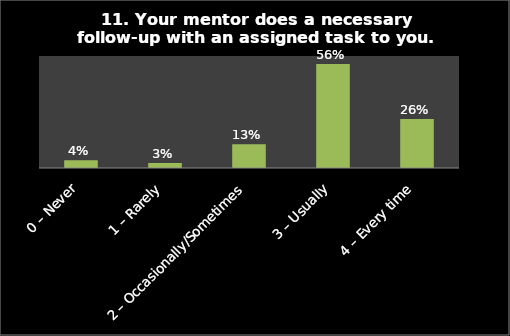
| Category | Series 0 |
|---|---|
| 0 – Never | 0.041 |
| 1 – Rarely | 0.026 |
| 2 – Occasionally/Sometimes | 0.127 |
| 3 – Usually | 0.557 |
| 4 – Every time | 0.262 |